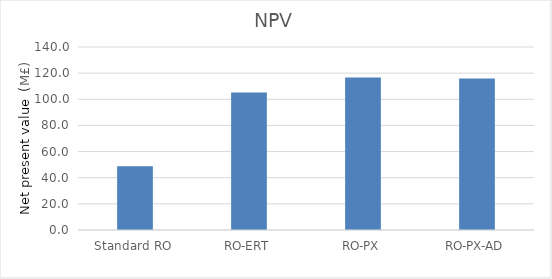
| Category | Series 0 |
|---|---|
| Standard RO | 48.679 |
| RO-ERT | 105.173 |
| RO-PX | 116.753 |
| RO-PX-AD | 115.913 |